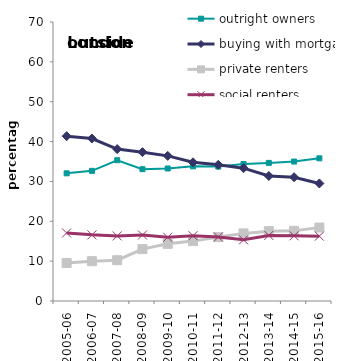
| Category | outright owners | buying with mortgage | private renters | social renters |
|---|---|---|---|---|
| 2005-06 | 32.034 | 41.356 | 9.543 | 17.067 |
| 2006-07 | 32.652 | 40.77 | 9.986 | 16.593 |
| 2007-08 | 35.324 | 38.116 | 10.232 | 16.328 |
| 2008-09 | 33.075 | 37.344 | 13.026 | 16.555 |
| 2009-10 | 33.247 | 36.413 | 14.343 | 15.997 |
| 2010-11 | 33.786 | 34.8 | 15.027 | 16.387 |
| 2011-12 | 33.73 | 34.173 | 16.033 | 16.065 |
| 2012-13 | 34.363 | 33.328 | 16.964 | 15.345 |
| 2013-14 | 34.648 | 31.374 | 17.527 | 16.451 |
| 2014-15 | 34.986 | 31.057 | 17.594 | 16.362 |
| 2015-16 | 35.798 | 29.494 | 18.436 | 16.272 |